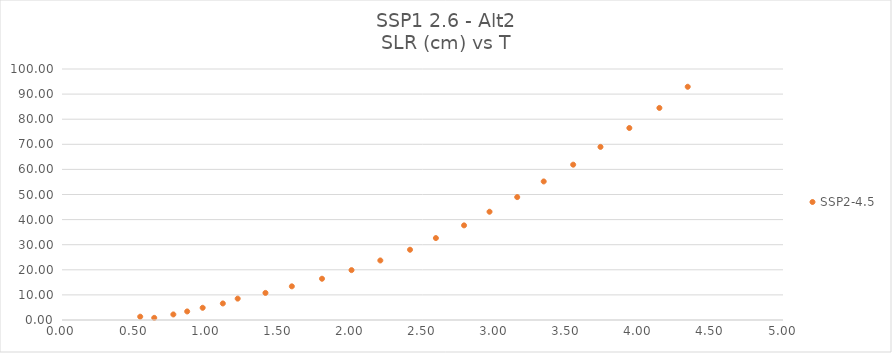
| Category | SSP2-4.5 |
|---|---|
| 0.639593181 | 0.851 |
| 0.542364652 | 1.315 |
| 0.772130534 | 2.215 |
| 0.868150926 | 3.412 |
| 0.975561417 | 4.865 |
| 1.115356613 | 6.592 |
| 1.218373475 | 8.518 |
| 1.410985436 | 10.794 |
| 1.593934848 | 13.413 |
| 1.803124946 | 16.439 |
| 2.007801221 | 19.874 |
| 2.207533083 | 23.719 |
| 2.413479456 | 27.994 |
| 2.592828574 | 32.641 |
| 2.788135632 | 37.702 |
| 2.964847005 | 43.132 |
| 3.15685426 | 48.972 |
| 3.340596123 | 55.201 |
| 3.544935632 | 61.878 |
| 3.734313966 | 68.965 |
| 3.934477593 | 76.492 |
| 4.14283573 | 84.488 |
| 4.339264848 | 92.92 |